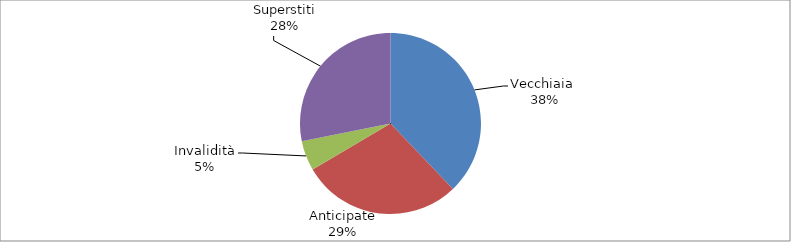
| Category | Series 0 |
|---|---|
| Vecchiaia  | 6785 |
| Anticipate | 5121 |
| Invalidità | 957 |
| Superstiti | 5043 |